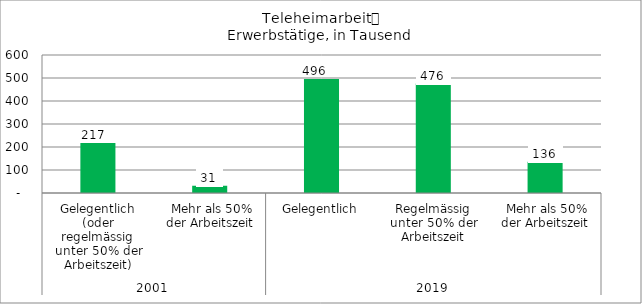
| Category | Teleheimarbeit |
|---|---|
| 0 | 217 |
| 1 | 31 |
| 2 | 496 |
| 3 | 476 |
| 4 | 136 |